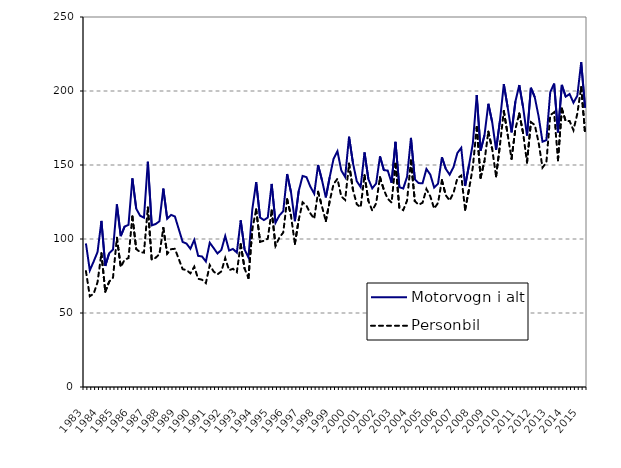
| Category | Motorvogn i alt | Personbil |
|---|---|---|
| 1983.0 | 97 | 78.3 |
| nan | 78.8 | 61.3 |
| nan | 84.8 | 63 |
| nan | 91.2 | 70.8 |
| 1984.0 | 112.2 | 90.4 |
| nan | 81.8 | 64.4 |
| nan | 90.4 | 71.1 |
| nan | 92.9 | 73.9 |
| 1985.0 | 123.4 | 100.8 |
| nan | 102 | 81.1 |
| nan | 108.4 | 86 |
| nan | 109.6 | 87.1 |
| 1986.0 | 141 | 115.2 |
| nan | 120.5 | 93.2 |
| nan | 115.7 | 91.1 |
| nan | 114.4 | 90.8 |
| 1987.0 | 152.2 | 121.3 |
| nan | 109.2 | 86.1 |
| nan | 110.1 | 87.3 |
| nan | 112 | 89.8 |
| 1988.0 | 134.1 | 107.5 |
| nan | 113.7 | 90 |
| nan | 116.3 | 93.1 |
| nan | 115.2 | 93.4 |
| 1989.0 | 106.6 | 86.4 |
| nan | 98 | 79.6 |
| nan | 96.9 | 79 |
| nan | 93.4 | 76.8 |
| 1990.0 | 99.4 | 81.3 |
| nan | 88.6 | 73.1 |
| nan | 88.2 | 72.5 |
| nan | 84.8 | 70.2 |
| 1991.0 | 97.5 | 82.4 |
| nan | 93.9 | 78 |
| nan | 90.2 | 76.1 |
| nan | 92.6 | 78.1 |
| 1992.0 | 102 | 87.1 |
| nan | 92.2 | 78.9 |
| nan | 93.3 | 79.9 |
| nan | 90.8 | 77.6 |
| 1993.0 | 112.6 | 96.5 |
| nan | 93 | 80.1 |
| nan | 87.5 | 73.6 |
| nan | 120.1 | 106.6 |
| 1994.0 | 138.4 | 120 |
| nan | 114.5 | 98.1 |
| nan | 112.8 | 98.8 |
| nan | 114.5 | 100.2 |
| 1995.0 | 137.2 | 119.3 |
| nan | 111 | 95.4 |
| nan | 115.9 | 101 |
| nan | 118.8 | 104.4 |
| 1996.0 | 143.9 | 126.9 |
| nan | 131.6 | 115.7 |
| nan | 112 | 96.7 |
| nan | 132.5 | 113.1 |
| 1997.0 | 142.6 | 124.8 |
| nan | 141.8 | 122.5 |
| nan | 135.4 | 117.3 |
| nan | 130.6 | 113.7 |
| 1998.0 | 150 | 131.9 |
| nan | 139.8 | 122 |
| nan | 128.1 | 112.1 |
| nan | 141.8 | 125.6 |
| 1999.0 | 154.2 | 137.1 |
| nan | 159.3 | 140.7 |
| nan | 146.3 | 128.7 |
| nan | 141.9 | 126.4 |
| 2000.0 | 169.1 | 150.9 |
| nan | 151.5 | 133.4 |
| nan | 139 | 123.5 |
| nan | 135.1 | 121.4 |
| 2001.0 | 158.5 | 143.1 |
| nan | 140.46 | 125.7 |
| nan | 134.24 | 119.2 |
| nan | 137.495 | 124.072 |
| 2002.0 | 155.814 | 141.724 |
| nan | 146.543 | 133.19 |
| nan | 146.231 | 127.141 |
| nan | 137.967 | 124.641 |
| 2003.0 | 165.679 | 150.811 |
| nan | 135.021 | 121.101 |
| nan | 134.111 | 119.491 |
| nan | 142.013 | 125.959 |
| 2004.0 | 168.309 | 153.043 |
| nan | 140.267 | 125.568 |
| nan | 137.77 | 123.121 |
| nan | 137.685 | 124.506 |
| 2005.0 | 147.311 | 133.756 |
| nan | 143.517 | 128.79 |
| nan | 134.783 | 120.571 |
| nan | 137.37 | 124.382 |
| 2006.0 | 155.213 | 139.728 |
| nan | 147.444 | 129.572 |
| nan | 143.451 | 126.006 |
| nan | 148.561 | 131.195 |
| 2007.0 | 158.1 | 141.084 |
| nan | 161.613 | 142.897 |
| nan | 135.821 | 119.753 |
| nan | 149.791 | 133.498 |
| 2008.0 | 164.642 | 148.614 |
| nan | 197.287 | 175.714 |
| nan | 159.718 | 141.407 |
| nan | 170.057 | 152.54 |
| 2009.0 | 191.38 | 172.559 |
| nan | 178.906 | 160.765 |
| nan | 160.234 | 142.312 |
| nan | 179.857 | 163.532 |
| 2010.0 | 204.636 | 186.507 |
| nan | 188.957 | 170.463 |
| nan | 172.077 | 154.156 |
| nan | 192.961 | 174.399 |
| 2011.0 | 204.005 | 184.86 |
| nan | 188.741 | 171.333 |
| nan | 169.934 | 151.694 |
| nan | 202.176 | 178.919 |
| 2012.0 | 195.829 | 177.072 |
| nan | 182.751 | 165.128 |
| nan | 165.73 | 148.242 |
| nan | 166.805 | 151.728 |
| 2013.0 | 199.181 | 183.653 |
| nan | 205.015 | 185.634 |
| nan | 172.044 | 153.21 |
| nan | 204.1 | 188.079 |
| 2014.0 | 196.177 | 179.552 |
| nan | 197.965 | 179.767 |
| nan | 192.105 | 173.474 |
| nan | 196.809 | 184.739 |
| 2015.0 | 219.419 | 202.592 |
| nan | 188.696 | 171.451 |